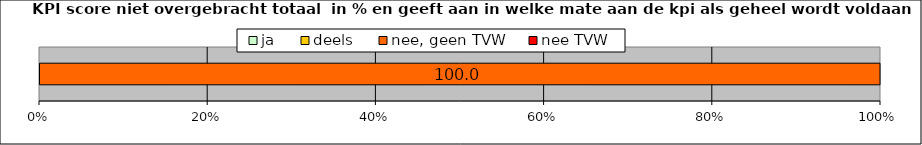
| Category | ja | deels | nee, geen TVW | nee TVW |
|---|---|---|---|---|
| 0 | 0 | 0 | 100 | 0 |